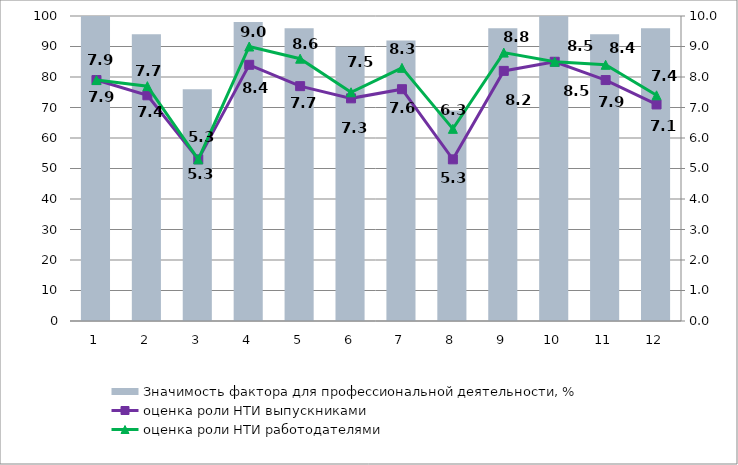
| Category | Значимость фактора для профессиональной деятельности, % |
|---|---|
| 1.0 | 100 |
| 2.0 | 94 |
| 3.0 | 76 |
| 4.0 | 98 |
| 5.0 | 96 |
| 6.0 | 90 |
| 7.0 | 92 |
| 8.0 | 69 |
| 9.0 | 96 |
| 10.0 | 100 |
| 11.0 | 94 |
| 12.0 | 96 |